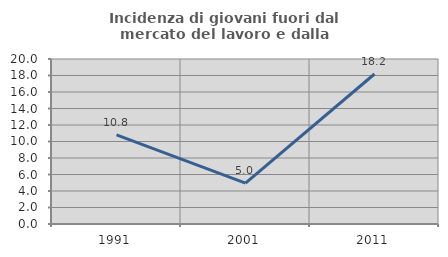
| Category | Incidenza di giovani fuori dal mercato del lavoro e dalla formazione  |
|---|---|
| 1991.0 | 10.811 |
| 2001.0 | 4.95 |
| 2011.0 | 18.182 |